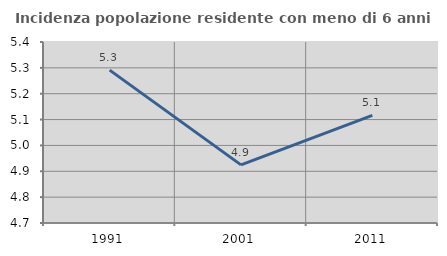
| Category | Incidenza popolazione residente con meno di 6 anni |
|---|---|
| 1991.0 | 5.291 |
| 2001.0 | 4.925 |
| 2011.0 | 5.116 |